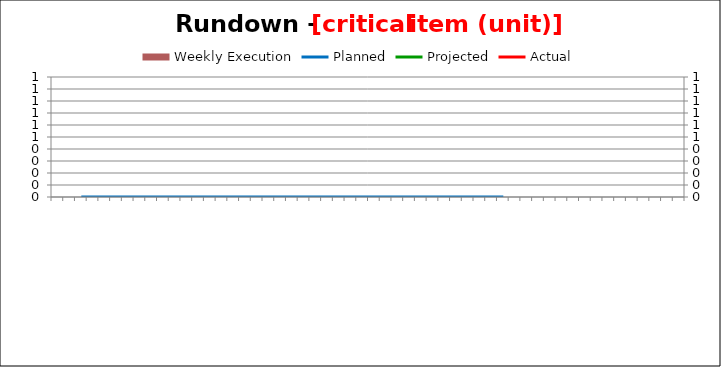
| Category | Weekly Execution |
|---|---|
| #REF! | 1 |